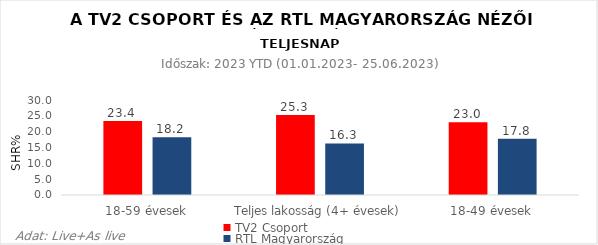
| Category | TV2 Csoport | RTL Magyarország |
|---|---|---|
| 18-59 évesek | 23.4 | 18.2 |
| Teljes lakosság (4+ évesek) | 25.3 | 16.3 |
| 18-49 évesek | 23 | 17.8 |